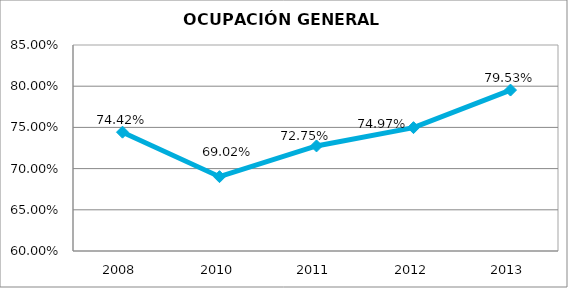
| Category | Series 0 |
|---|---|
| 2008.0 | 0.744 |
| 2010.0 | 0.69 |
| 2011.0 | 0.728 |
| 2012.0 | 0.75 |
| 2013.0 | 0.795 |